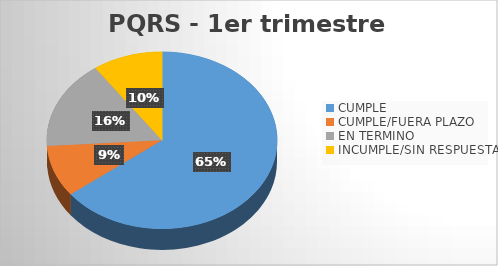
| Category | Series 0 | Series 1 |
|---|---|---|
| CUMPLE | 650 | 0.645 |
| CUMPLE/FUERA PLAZO | 95 | 0.094 |
| EN TERMINO | 163 | 0.162 |
| INCUMPLE/SIN RESPUESTA | 99 | 0.098 |